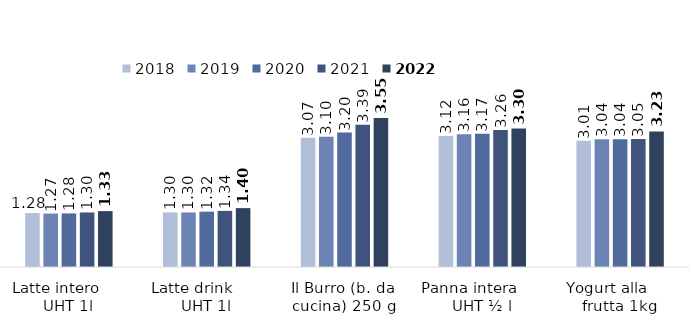
| Category | 2018 | 2019 | 2020 | 2021 | 2022 |
|---|---|---|---|---|---|
| Latte intero      UHT 1l | 1.284 | 1.273 | 1.276 | 1.298 | 1.331 |
| Latte drink       UHT 1l | 1.3 | 1.299 | 1.318 | 1.336 | 1.402 |
| Il Burro (b. da cucina) 250 g | 3.075 | 3.101 | 3.2 | 3.386 | 3.546 |
| Panna intera      UHT ½ l | 3.121 | 3.163 | 3.173 | 3.262 | 3.297 |
| Yogurt alla      frutta 1kg | 3.008 | 3.042 | 3.041 | 3.046 | 3.229 |